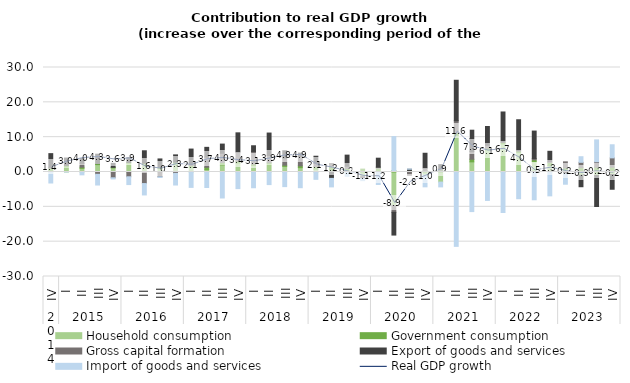
| Category | Household consumption | Government consumption | Gross capital formation | Export of goods and services | Import of goods and services |
|---|---|---|---|---|---|
| 0 | 0.49 | 0.61 | 0.236 | 3.937 | -3.157 |
| 1 | 1.471 | 0.435 | 0.021 | 2.085 | -0.014 |
| 2 | 1.039 | 0.337 | 1.112 | 1.391 | -0.814 |
| 3 | 2.12 | 0.288 | -0.668 | 2.703 | -3.069 |
| 4 | 1.174 | 0.162 | -1.666 | 1.145 | -0.326 |
| 5 | 2.517 | 0.209 | -1.374 | 1.445 | -2.234 |
| 6 | 2.29 | 0.236 | -3.319 | 3.566 | -3.269 |
| 7 | 1.009 | 0.329 | -1.382 | 2.41 | -0.187 |
| 8 | 2.282 | 0.533 | -0.392 | 2.101 | -3.346 |
| 9 | 1.274 | 0.589 | 0.265 | 4.455 | -4.419 |
| 10 | 0.66 | 0.699 | 2.927 | 2.793 | -4.445 |
| 11 | 2.049 | 0.676 | 2.659 | 2.63 | -7.46 |
| 12 | 2.581 | 0.547 | 2.485 | 5.628 | -4.771 |
| 13 | 1.86 | 0.414 | 3.624 | 1.633 | -4.518 |
| 14 | 2.365 | 0.32 | 2.069 | 6.43 | -3.612 |
| 15 | 1.604 | 0.354 | 2.054 | 2.09 | -4.196 |
| 16 | 1.243 | 0.516 | 2.689 | 0.977 | -4.508 |
| 17 | 0.792 | 0.795 | 0.885 | 2.054 | -2.108 |
| 18 | 0.591 | 0.939 | 0.912 | -1.831 | -2.443 |
| 19 | 0.049 | 0.954 | 0.657 | 3.184 | -1.25 |
| 20 | -1.163 | 0.829 | -0.626 | -0.108 | -0.585 |
| 21 | 0.483 | 0.599 | 0.343 | 2.54 | -3.586 |
| 22 | -9.615 | 0.379 | -1.954 | -6.537 | 9.789 |
| 23 | 0.093 | 0.31 | -0.95 | 0.39 | 0.067 |
| 24 | -0.891 | 0.434 | 0.593 | 4.353 | -3.369 |
| 25 | -2.895 | 0.554 | 0.392 | 1.176 | -1.379 |
| 26 | 10.516 | 0.77 | 3.439 | 11.611 | -21.347 |
| 27 | 2.909 | 0.761 | 2.166 | 6.162 | -11.364 |
| 28 | 6.328 | 0.521 | 0.833 | 5.375 | -8.162 |
| 29 | 8.07 | 0.422 | 0.12 | 8.62 | -11.634 |
| 30 | 5.571 | 0.455 | 0.073 | 8.903 | -7.668 |
| 31 | 2.943 | 0.538 | 0.373 | 7.897 | -7.971 |
| 32 | 1.86 | 0.869 | 0.331 | 2.88 | -6.848 |
| 33 | -0.113 | 1.143 | 1.775 | -0.404 | -2.994 |
| 34 | -0.921 | 1.258 | 1.52 | -3.307 | 1.609 |
| 35 | -0.971 | 1.388 | 1.555 | -8.934 | 6.27 |
| 36 | -0.718 | 1.384 | 2.671 | -4.235 | 3.763 |